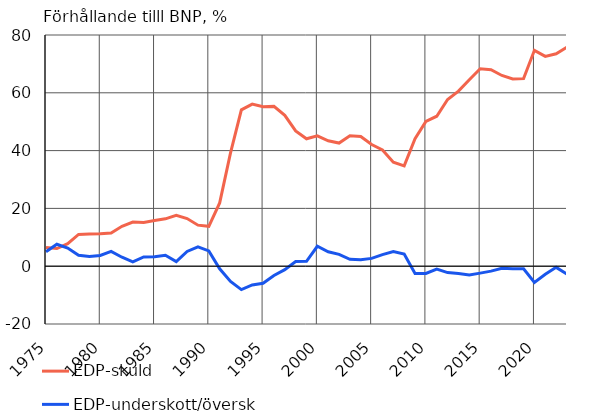
| Category | EDP-skuld | EDP-underskott/överskott |
|---|---|---|
| 1975 | 6.5 | 5 |
| 1976 | 6.1 | 7.6 |
| 1977 | 7.8 | 6.3 |
| 1978 | 11 | 3.8 |
| 1979 | 11.1 | 3.4 |
| 1980 | 11.2 | 3.7 |
| 1981 | 11.5 | 5.1 |
| 1982 | 13.8 | 3.1 |
| 1983 | 15.3 | 1.5 |
| 1984 | 15.1 | 3.2 |
| 1985 | 15.8 | 3.3 |
| 1986 | 16.4 | 3.8 |
| 1987 | 17.6 | 1.6 |
| 1988 | 16.5 | 5.1 |
| 1989 | 14.2 | 6.7 |
| 1990 | 13.8 | 5.3 |
| 1991 | 21.9 | -0.9 |
| 1992 | 39.2 | -5.3 |
| 1993 | 54.1 | -8.1 |
| 1994 | 56.1 | -6.5 |
| 1995 | 55.2 | -5.9 |
| 1996 | 55.3 | -3.2 |
| 1997 | 52.2 | -1.2 |
| 1998 | 46.8 | 1.6 |
| 1999 | 44.1 | 1.7 |
| 2000 | 45.1 | 6.9 |
| 2001 | 43.4 | 5 |
| 2002 | 42.6 | 4.1 |
| 2003 | 45.1 | 2.4 |
| 2004 | 44.9 | 2.2 |
| 2005 | 42.1 | 2.7 |
| 2006 | 40.2 | 4 |
| 2007 | 36 | 5.1 |
| 2008 | 34.7 | 4.2 |
| 2009 | 44.1 | -2.5 |
| 2010 | 50.1 | -2.5 |
| 2011 | 51.9 | -1 |
| 2012 | 57.7 | -2.2 |
| 2013 | 60.6 | -2.5 |
| 2014 | 64.5 | -3 |
| 2015 | 68.3 | -2.4 |
| 2016 | 68 | -1.7 |
| 2017 | 66 | -0.7 |
| 2018 | 64.8 | -0.9 |
| 2019 | 64.9 | -0.9 |
| 2020 | 74.7 | -5.6 |
| 2021 | 72.6 | -2.8 |
| 2022* | 73.5 | -0.4 |
| 2023* | 75.8 | -2.7 |